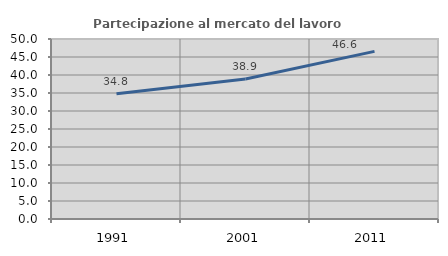
| Category | Partecipazione al mercato del lavoro  femminile |
|---|---|
| 1991.0 | 34.796 |
| 2001.0 | 38.892 |
| 2011.0 | 46.556 |